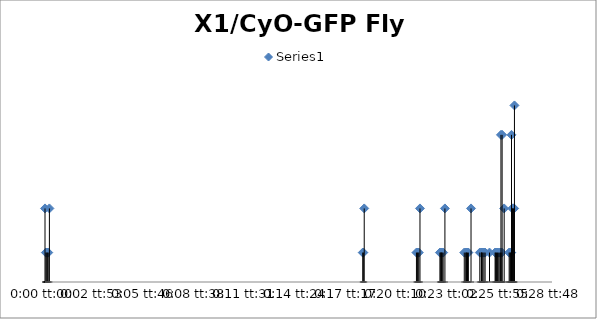
| Category | Series 0 |
|---|---|
| 0.0 | 5 |
| 3.472222222222765e-05 | 2 |
| 6.94444444444553e-05 | 2 |
| 9.259259259258856e-05 | 2 |
| 0.0001273148148148162 | 2 |
| 0.00017361111111108274 | 5 |
| 0.012534722222222211 | 2 |
| 0.012557870370370372 | 2 |
| 0.0125925925925926 | 5 |
| 0.014652777777777765 | 2 |
| 0.014687499999999992 | 2 |
| 0.014710648148148153 | 2 |
| 0.014745370370370381 | 2 |
| 0.014791666666666675 | 5 |
| 0.015578703703703678 | 2 |
| 0.015613425925925906 | 2 |
| 0.015625 | 2 |
| 0.015636574074074067 | 2 |
| 0.015671296296296294 | 2 |
| 0.015706018518518522 | 2 |
| 0.015775462962962977 | 5 |
| 0.016539351851851847 | 2 |
| 0.016597222222222208 | 2 |
| 0.01662037037037037 | 2 |
| 0.016631944444444435 | 2 |
| 0.016666666666666663 | 2 |
| 0.01670138888888889 | 2 |
| 0.016805555555555546 | 5 |
| 0.017152777777777795 | 2 |
| 0.017210648148148155 | 2 |
| 0.01722222222222225 | 2 |
| 0.01723379629629629 | 2 |
| 0.017268518518518516 | 2 |
| 0.01731481481481481 | 2 |
| 0.017361111111111105 | 2 |
| 0.017534722222222215 | 2 |
| 0.01775462962962962 | 2 |
| 0.01777777777777778 | 2 |
| 0.01781250000000001 | 2 |
| 0.017847222222222237 | 2 |
| 0.017881944444444464 | 2 |
| 0.017939814814814797 | 2 |
| 0.017974537037037025 | 2 |
| 0.01798611111111109 | 10 |
| 0.01802083333333332 | 2 |
| 0.018032407407407414 | 10 |
| 0.018113425925925936 | 5 |
| 0.01831018518518518 | 2 |
| 0.018344907407407407 | 2 |
| 0.018368055555555568 | 2 |
| 0.01839120370370373 | 2 |
| 0.018402777777777796 | 10 |
| 0.018437499999999996 | 5 |
| 0.018449074074074062 | 5 |
| 0.01848379629629629 | 5 |
| 0.01850694444444445 | 5 |
| 0.018518518518518517 | 12 |